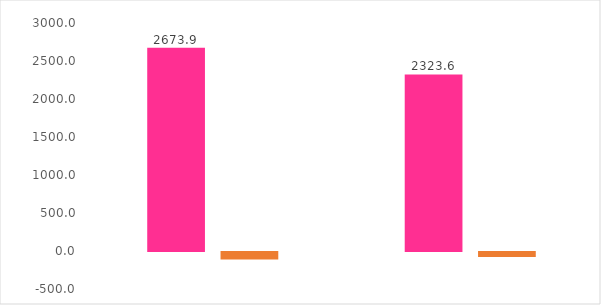
| Category | Прибыль | Убыток |
|---|---|---|
| 2018.0 | 2673.878 | -97.579 |
| 2019.0 | 2323.6 | -64.5 |